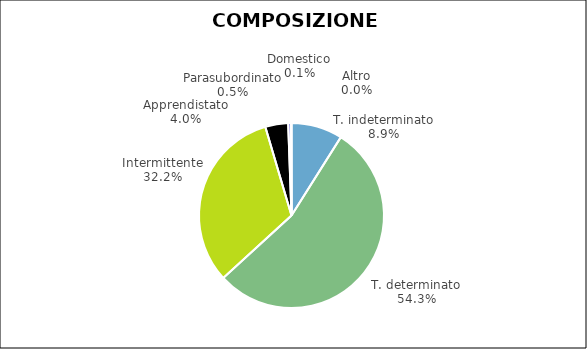
| Category | Series 0 |
|---|---|
| T. indeterminato | 1789 |
| T. determinato | 10852 |
| Intermittente | 6444 |
| Apprendistato | 800 |
| Parasubordinato | 96 |
| Domestico | 12 |
| Altro | 7 |